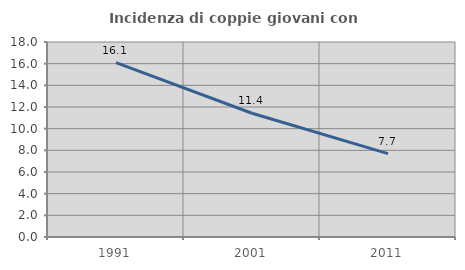
| Category | Incidenza di coppie giovani con figli |
|---|---|
| 1991.0 | 16.103 |
| 2001.0 | 11.422 |
| 2011.0 | 7.698 |